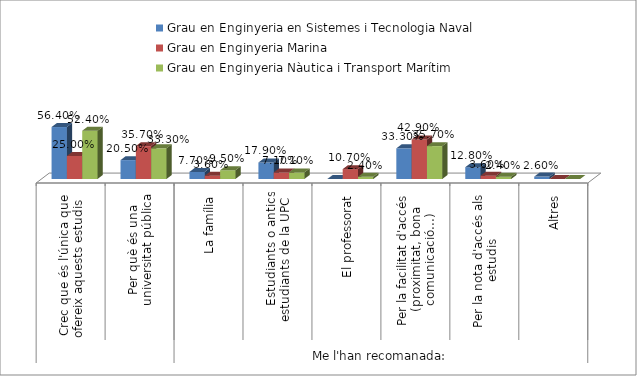
| Category | Grau en Enginyeria en Sistemes i Tecnologia Naval | Grau en Enginyeria Marina | Grau en Enginyeria Nàutica i Transport Marítim |
|---|---|---|---|
| 0 | 0.564 | 0.25 | 0.524 |
| 1 | 0.205 | 0.357 | 0.333 |
| 2 | 0.077 | 0.036 | 0.095 |
| 3 | 0.179 | 0.071 | 0.071 |
| 4 | 0 | 0.107 | 0.024 |
| 5 | 0.333 | 0.429 | 0.357 |
| 6 | 0.128 | 0.036 | 0.024 |
| 7 | 0.026 | 0 | 0 |